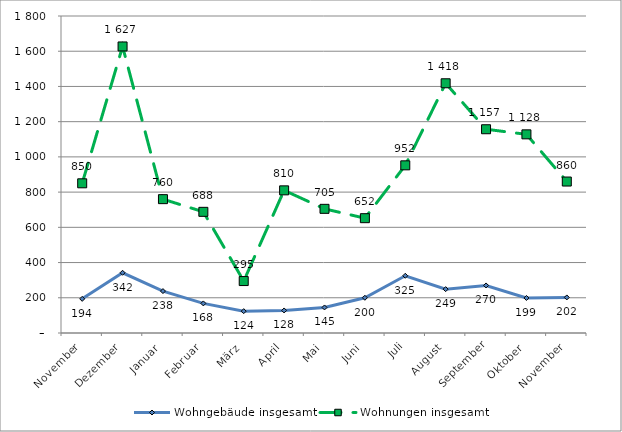
| Category | Wohngebäude insgesamt | Wohnungen insgesamt |
|---|---|---|
| November | 194 | 850 |
| Dezember | 342 | 1627 |
| Januar | 238 | 760 |
| Februar | 168 | 688 |
| März | 124 | 295 |
| April | 128 | 810 |
| Mai | 145 | 705 |
| Juni | 200 | 652 |
| Juli | 325 | 952 |
| August | 249 | 1418 |
| September | 270 | 1157 |
| Oktober | 199 | 1128 |
| November | 202 | 860 |